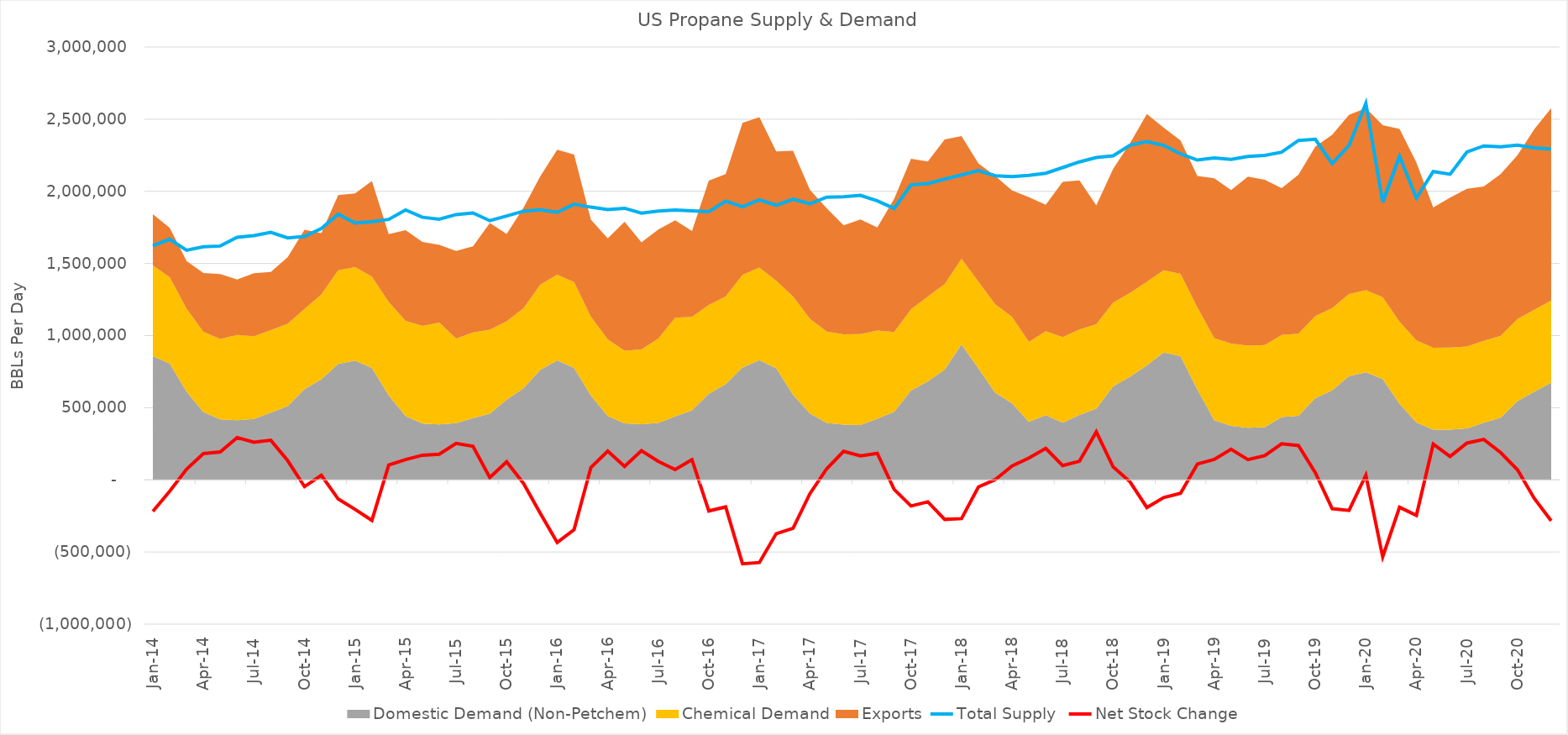
| Category | Total Supply  | Net Stock Change  |
|---|---|---|
| 2014-01-15 | 1622096.774 | -218812.004 |
| 2014-02-15 | 1667821.429 | -78513.781 |
| 2014-03-15 | 1591032.258 | 74364.262 |
| 2014-04-15 | 1615666.667 | 182207.802 |
| 2014-05-15 | 1620741.935 | 193736.502 |
| 2014-06-15 | 1681100 | 293050.86 |
| 2014-07-15 | 1692967.742 | 261088.504 |
| 2014-08-15 | 1716129.032 | 274528.162 |
| 2014-09-15 | 1677000 | 133607.39 |
| 2014-10-15 | 1686709.677 | -46792.743 |
| 2014-11-15 | 1742100 | 31982.998 |
| 2014-12-15 | 1841806.452 | -132653.105 |
| 2015-01-15 | 1780129.032 | -204661.372 |
| 2015-02-15 | 1789500 | -281201.886 |
| 2015-03-15 | 1805612.903 | 102788.25 |
| 2015-04-15 | 1870600 | 140352.809 |
| 2015-05-15 | 1820290.323 | 170704.641 |
| 2015-06-15 | 1806333.333 | 177689.058 |
| 2015-07-15 | 1838838.71 | 252485.588 |
| 2015-08-15 | 1850225.806 | 232166.674 |
| 2015-09-15 | 1796500 | 16077.309 |
| 2015-10-15 | 1829354.839 | 125142.748 |
| 2015-11-15 | 1862033.333 | -24429.85 |
| 2015-12-15 | 1871193.548 | -233155.946 |
| 2016-01-15 | 1854225.806 | -433807.116 |
| 2016-02-15 | 1910482.759 | -344954.67 |
| 2016-03-15 | 1890225.806 | 86050.25 |
| 2016-04-15 | 1873600 | 198952.211 |
| 2016-05-15 | 1882548.387 | 93436.076 |
| 2016-06-15 | 1848600 | 202097.179 |
| 2016-07-15 | 1862903.226 | 128000.653 |
| 2016-08-15 | 1870387.097 | 71346.679 |
| 2016-09-15 | 1864706.768 | 140225.543 |
| 2016-10-15 | 1858399.241 | -215469.31 |
| 2016-11-15 | 1931774.435 | -187649.831 |
| 2016-12-15 | 1892723.822 | -581602.206 |
| 2017-01-15 | 1940660.306 | -573193.799 |
| 2017-02-15 | 1903811.882 | -373222.104 |
| 2017-03-15 | 1945275.209 | -334968.793 |
| 2017-04-15 | 1913879.435 | -95813.261 |
| 2017-05-15 | 1959309.467 | 77208.867 |
| 2017-06-15 | 1962100 | 197463.175 |
| 2017-07-15 | 1971967.742 | 166694.729 |
| 2017-08-15 | 1933510.444 | 183314.166 |
| 2017-09-15 | 1881212.027 | -66547.321 |
| 2017-10-15 | 2044613.619 | -181194.289 |
| 2017-11-15 | 2054398.489 | -152314.362 |
| 2017-12-15 | 2084671.157 | -274333.4 |
| 2018-01-15 | 2113450.393 | -268758.608 |
| 2018-02-15 | 2143647.86 | -49639.725 |
| 2018-03-15 | 2108130.29 | 1712.803 |
| 2018-04-15 | 2101524.814 | 96421.608 |
| 2018-05-15 | 2110293.223 | 151703.929 |
| 2018-06-15 | 2125167.44 | 217850.972 |
| 2018-07-15 | 2164567.713 | 99130.761 |
| 2018-08-15 | 2203928.897 | 128939.214 |
| 2018-09-15 | 2234354.001 | 332504.369 |
| 2018-10-15 | 2246171.603 | 90221.547 |
| 2018-11-15 | 2319715.176 | -13701.306 |
| 2018-12-15 | 2344218.297 | -191915.327 |
| 2019-01-15 | 2318317.083 | -122504.961 |
| 2019-02-15 | 2259581.503 | -93176.86 |
| 2019-03-15 | 2216760.238 | 109840.337 |
| 2019-04-15 | 2231633.957 | 141391.928 |
| 2019-05-15 | 2221181.755 | 211980.343 |
| 2019-06-15 | 2241579.876 | 140112.921 |
| 2019-07-15 | 2248656.894 | 168353.503 |
| 2019-08-15 | 2271129.729 | 249706.075 |
| 2019-09-15 | 2352659.841 | 237907.813 |
| 2019-10-15 | 2360246.456 | 50171.903 |
| 2019-11-15 | 2192136.179 | -200035.022 |
| 2019-12-15 | 2317559.536 | -212379.812 |
| 2020-01-15 | 2609069.9 | 32087.635 |
| 2020-02-15 | 1924419.929 | -533448.857 |
| 2020-03-15 | 2242835.635 | -189964.436 |
| 2020-04-15 | 1953318.981 | -246014.3 |
| 2020-05-15 | 2136673.528 | 248420.634 |
| 2020-06-15 | 2118383.278 | 162054.841 |
| 2020-07-15 | 2272605.853 | 255153.078 |
| 2020-08-15 | 2314800.268 | 280608.576 |
| 2020-09-15 | 2308940.07 | 189134.005 |
| 2020-10-15 | 2320571.166 | 69786.659 |
| 2020-11-15 | 2301125.976 | -129372.256 |
| 2020-12-15 | 2292313.773 | -283841.069 |